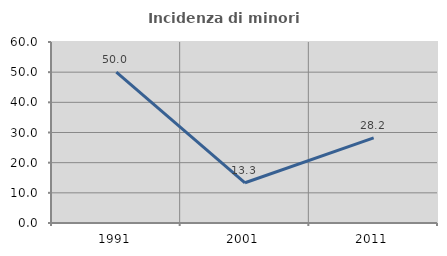
| Category | Incidenza di minori stranieri |
|---|---|
| 1991.0 | 50 |
| 2001.0 | 13.333 |
| 2011.0 | 28.205 |